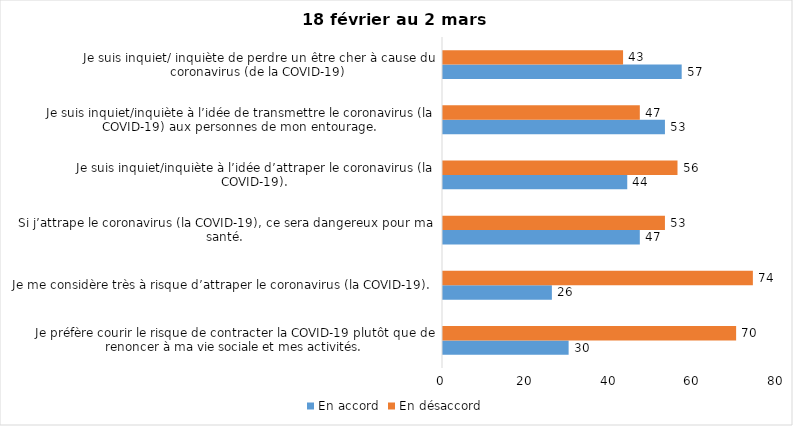
| Category | En accord | En désaccord |
|---|---|---|
| Je préfère courir le risque de contracter la COVID-19 plutôt que de renoncer à ma vie sociale et mes activités. | 30 | 70 |
| Je me considère très à risque d’attraper le coronavirus (la COVID-19). | 26 | 74 |
| Si j’attrape le coronavirus (la COVID-19), ce sera dangereux pour ma santé. | 47 | 53 |
| Je suis inquiet/inquiète à l’idée d’attraper le coronavirus (la COVID-19). | 44 | 56 |
| Je suis inquiet/inquiète à l’idée de transmettre le coronavirus (la COVID-19) aux personnes de mon entourage. | 53 | 47 |
| Je suis inquiet/ inquiète de perdre un être cher à cause du coronavirus (de la COVID-19) | 57 | 43 |